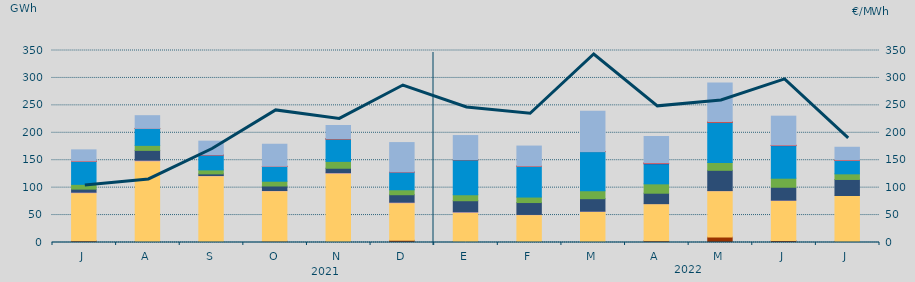
| Category | Carbón | Ciclo Combinado | Cogeneración | Consumo Bombeo | Eólica | Hidráulica | Nuclear | Otras Renovables | Solar fotovoltaica | Solar térmica | Turbinación bombeo |
|---|---|---|---|---|---|---|---|---|---|---|---|
| J | 3046.5 | 87665.5 | 1010.8 | 5572.7 | 8671.4 | 41981.5 | 296.5 | 0 | 8.5 | 116.7 | 20483.6 |
| A | 1481.1 | 147327 | 1240.2 | 17886.3 | 9117.1 | 30800.2 | 0 | 0 | 64.2 | 91.5 | 23170.3 |
| S | 929.2 | 120567.6 | 582.6 | 3027.8 | 7256.6 | 27279.3 | 289.1 | 9.8 | 66.3 | 68.7 | 24660.8 |
| O | 2449.3 | 91772.5 | 539.6 | 8249.9 | 8677.5 | 26982.9 | 0 | 3.2 | 196.7 | 36.5 | 40197.4 |
| N | 1901 | 124474.7 | 919.8 | 8069.5 | 12499.1 | 40973.4 | 0.4 | 0 | 312.6 | 0.3 | 24114.5 |
| D | 3972.3 | 68425.3 | 1069.5 | 13639.4 | 9010.9 | 31863.1 | 841.6 | 0.5 | 182.8 | 0 | 53138.5 |
| E | 1857.5 | 53248.9 | 859.7 | 20175.8 | 10885.7 | 63478.2 | 410.2 | 0 | 271.2 | 0 | 43785.9 |
| F | 1422.4 | 49296.1 | 416.6 | 21707.5 | 9996.4 | 56385.2 | 0 | 0 | 73.3 | 57.8 | 36436.3 |
| M | 696.5 | 56010.8 | 391.8 | 22798.3 | 14218 | 71626.6 | 0 | 7.4 | 87.7 | 6.7 | 73580.2 |
| A | 3349.534 | 67415.187 | 93.591 | 18989.102 | 17056.874 | 36445.011 | 1248.7 | 45.8 | 106.634 | 333.066 | 48166.851 |
| M | 10012.495 | 84316.131 | 342.191 | 36920.803 | 14355.123 | 73448.126 | 0.3 | 0 | 350.4 | 549.325 | 70399.534 |
| J | 3803.776 | 72994.164 | 408.816 | 23523.459 | 16484.811 | 59296.475 | 327.825 | 3.325 | 281.65 | 342.175 | 52808.788 |
| J | 2026.357 | 83630.229 | 62.5 | 29193.443 | 10247.658 | 24517.982 | 107.35 | 0 | 186.925 | 340.15 | 23284.195 |